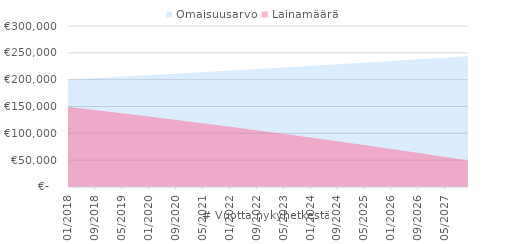
| Category | Omaisuusarvo | Lainamäärä |
|---|---|---|
| 2018-01-01 | 200330.316 | 149275 |
| 2018-02-01 | 200661.178 | 148548.312 |
| 2018-03-01 | 200992.586 | 147819.933 |
| 2018-04-01 | 201324.542 | 147089.856 |
| 2018-05-01 | 201657.046 | 146358.077 |
| 2018-06-01 | 201990.099 | 145624.591 |
| 2018-07-01 | 202323.702 | 144889.394 |
| 2018-08-01 | 202657.856 | 144152.48 |
| 2018-09-01 | 202992.562 | 143413.844 |
| 2018-10-01 | 203327.821 | 142673.482 |
| 2018-11-01 | 203663.633 | 141931.389 |
| 2018-12-01 | 204000 | 141187.559 |
| 2019-01-01 | 204336.923 | 140441.988 |
| 2019-02-01 | 204674.402 | 139694.671 |
| 2019-03-01 | 205012.438 | 138945.602 |
| 2019-04-01 | 205351.033 | 138194.777 |
| 2019-05-01 | 205690.187 | 137442.191 |
| 2019-06-01 | 206029.901 | 136687.838 |
| 2019-07-01 | 206370.176 | 135931.714 |
| 2019-08-01 | 206711.013 | 135173.813 |
| 2019-09-01 | 207052.413 | 134414.13 |
| 2019-10-01 | 207394.377 | 133652.66 |
| 2019-11-01 | 207736.906 | 132889.399 |
| 2019-12-01 | 208080 | 132124.34 |
| 2020-01-01 | 208423.661 | 131357.479 |
| 2020-02-01 | 208767.89 | 130588.811 |
| 2020-03-01 | 209112.687 | 129818.329 |
| 2020-04-01 | 209458.053 | 129046.03 |
| 2020-05-01 | 209803.99 | 128271.907 |
| 2020-06-01 | 210150.499 | 127495.956 |
| 2020-07-01 | 210497.579 | 126718.171 |
| 2020-08-01 | 210845.233 | 125938.547 |
| 2020-09-01 | 211193.461 | 125157.079 |
| 2020-10-01 | 211542.264 | 124373.76 |
| 2020-11-01 | 211891.644 | 123588.587 |
| 2020-12-01 | 212241.6 | 122801.553 |
| 2021-01-01 | 212592.134 | 122012.653 |
| 2021-02-01 | 212943.247 | 121221.881 |
| 2021-03-01 | 213294.941 | 120429.233 |
| 2021-04-01 | 213647.214 | 119634.702 |
| 2021-05-01 | 214000.07 | 118838.284 |
| 2021-06-01 | 214353.509 | 118039.973 |
| 2021-07-01 | 214707.531 | 117239.762 |
| 2021-08-01 | 215062.138 | 116437.648 |
| 2021-09-01 | 215417.331 | 115633.624 |
| 2021-10-01 | 215773.11 | 114827.684 |
| 2021-11-01 | 216129.477 | 114019.823 |
| 2021-12-01 | 216486.432 | 113210.036 |
| 2022-01-01 | 216843.977 | 112398.316 |
| 2022-02-01 | 217202.112 | 111584.659 |
| 2022-03-01 | 217560.839 | 110769.058 |
| 2022-04-01 | 217920.159 | 109951.507 |
| 2022-05-01 | 218280.072 | 109132.002 |
| 2022-06-01 | 218640.579 | 108310.536 |
| 2022-07-01 | 219001.682 | 107487.104 |
| 2022-08-01 | 219363.381 | 106661.7 |
| 2022-09-01 | 219725.677 | 105834.317 |
| 2022-10-01 | 220088.572 | 105004.951 |
| 2022-11-01 | 220452.066 | 104173.595 |
| 2022-12-01 | 220816.161 | 103340.244 |
| 2023-01-01 | 221180.856 | 102504.892 |
| 2023-02-01 | 221546.155 | 101667.532 |
| 2023-03-01 | 221912.056 | 100828.159 |
| 2023-04-01 | 222278.562 | 99986.767 |
| 2023-05-01 | 222645.673 | 99143.351 |
| 2023-06-01 | 223013.39 | 98297.903 |
| 2023-07-01 | 223381.715 | 97450.418 |
| 2023-08-01 | 223750.648 | 96600.89 |
| 2023-09-01 | 224120.191 | 95749.314 |
| 2023-10-01 | 224490.343 | 94895.682 |
| 2023-11-01 | 224861.107 | 94039.989 |
| 2023-12-01 | 225232.484 | 93182.229 |
| 2024-01-01 | 225604.474 | 92322.396 |
| 2024-02-01 | 225977.078 | 91460.483 |
| 2024-03-01 | 226350.297 | 90596.485 |
| 2024-04-01 | 226724.133 | 89730.395 |
| 2024-05-01 | 227098.587 | 88862.206 |
| 2024-06-01 | 227473.658 | 87991.914 |
| 2024-07-01 | 227849.35 | 87119.511 |
| 2024-08-01 | 228225.661 | 86244.991 |
| 2024-09-01 | 228602.594 | 85368.349 |
| 2024-10-01 | 228980.15 | 84489.577 |
| 2024-11-01 | 229358.33 | 83608.669 |
| 2024-12-01 | 229737.134 | 82725.619 |
| 2025-01-01 | 230116.563 | 81840.421 |
| 2025-02-01 | 230496.619 | 80953.068 |
| 2025-03-01 | 230877.303 | 80063.554 |
| 2025-04-01 | 231258.616 | 79171.872 |
| 2025-05-01 | 231640.558 | 78278.016 |
| 2025-06-01 | 232023.131 | 77381.98 |
| 2025-07-01 | 232406.337 | 76483.756 |
| 2025-08-01 | 232790.174 | 75583.339 |
| 2025-09-01 | 233174.646 | 74680.721 |
| 2025-10-01 | 233559.753 | 73775.897 |
| 2025-11-01 | 233945.496 | 72868.859 |
| 2025-12-01 | 234331.876 | 71959.601 |
| 2026-01-01 | 234718.894 | 71048.116 |
| 2026-02-01 | 235106.552 | 70134.398 |
| 2026-03-01 | 235494.849 | 69218.44 |
| 2026-04-01 | 235883.788 | 68300.235 |
| 2026-05-01 | 236273.369 | 67379.776 |
| 2026-06-01 | 236663.594 | 66457.058 |
| 2026-07-01 | 237054.463 | 65532.072 |
| 2026-08-01 | 237445.978 | 64604.812 |
| 2026-09-01 | 237838.139 | 63675.271 |
| 2026-10-01 | 238230.948 | 62743.443 |
| 2026-11-01 | 238624.406 | 61809.32 |
| 2026-12-01 | 239018.514 | 60872.896 |
| 2027-01-01 | 239413.272 | 59934.164 |
| 2027-02-01 | 239808.683 | 58993.116 |
| 2027-03-01 | 240204.746 | 58049.746 |
| 2027-04-01 | 240601.464 | 57104.046 |
| 2027-05-01 | 240998.837 | 56156.01 |
| 2027-06-01 | 241396.866 | 55205.631 |
| 2027-07-01 | 241795.553 | 54252.901 |
| 2027-08-01 | 242194.898 | 53297.814 |
| 2027-09-01 | 242594.902 | 52340.361 |
| 2027-10-01 | 242995.567 | 51380.537 |
| 2027-11-01 | 243396.894 | 50418.334 |
| 2027-12-01 | 243798.884 | 49453.744 |